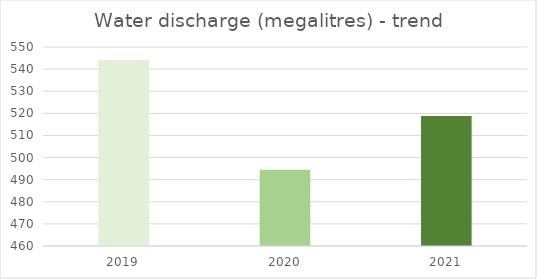
| Category | Series 0 |
|---|---|
| 0 | 544.16 |
| 1 | 494.45 |
| 2 | 518.84 |